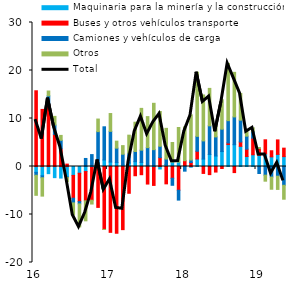
| Category | Maquinaria para la minería y la construcción | Buses y otros vehículos transporte | Camiones y vehículos de carga | Otros |
|---|---|---|---|---|
| 2016-03-01 | -1.213 | 15.775 | -0.613 | -4.175 |
| 2016-04-01 | -1.942 | 11.895 | -0.404 | -3.825 |
| 2016-05-01 | -1.491 | 12.864 | 1.858 | 1.003 |
| 2016-06-01 | -2.321 | 6.7 | 1.945 | 1.795 |
| 2016-07-01 | -2.407 | 3.67 | 1.787 | 1.022 |
| 2016-08-01 | -2.196 | 0.497 | -0.096 | -0.845 |
| 2016-09-01 | -1.855 | -4.757 | -0.971 | -2.512 |
| 2016-10-01 | -1.408 | -5.915 | -0.471 | -4.792 |
| 2016-11-01 | -1.056 | -6.1 | 1.675 | -4.161 |
| 2016-12-01 | -0.111 | -6.916 | 2.478 | -0.794 |
| 2017-01-01 | 0.698 | -8.519 | 6.567 | 2.621 |
| 2017-02-01 | 1.363 | -13.11 | 6.907 | -0.018 |
| 2017-03-01 | 0.921 | -13.717 | 6.403 | 3.71 |
| 2017-04-01 | 0.816 | -13.908 | 3.012 | 1.452 |
| 2017-05-01 | 0.305 | -13.155 | 2.256 | 1.787 |
| 2017-06-01 | 0.702 | -5.58 | 2.076 | 3.751 |
| 2017-07-01 | 1.002 | -1.924 | 2.126 | 6.097 |
| 2017-08-01 | 0.828 | -1.708 | 2.577 | 8.703 |
| 2017-09-01 | 0.169 | -3.657 | 3.76 | 6.466 |
| 2017-10-01 | -0.048 | -3.892 | 3.511 | 9.656 |
| 2017-11-01 | -0.515 | 1.85 | 2.367 | 7.241 |
| 2017-12-01 | 0.393 | -3.616 | 1.157 | 6.396 |
| 2018-01-01 | 0.92 | -2.448 | -1.466 | 4.077 |
| 2018-02-01 | 0.909 | -4.943 | -2.057 | 7.217 |
| 2018-03-01 | 0.222 | 0.985 | -0.971 | 7.041 |
| 2018-04-01 | -0.154 | 0.836 | 0.508 | 9.419 |
| 2018-05-01 | 1.564 | 1.617 | 3.1 | 13.351 |
| 2018-06-01 | 1.551 | -1.443 | 3.779 | 9.578 |
| 2018-07-01 | 2.508 | -1.692 | 5.968 | 7.798 |
| 2018-08-01 | 2.183 | -1.16 | 3.985 | 2.23 |
| 2018-09-01 | 3.115 | -0.42 | 4.659 | 6.13 |
| 2018-10-01 | 4.573 | 0.336 | 4.641 | 11.918 |
| 2018-11-01 | 4.542 | -1.269 | 5.787 | 9.285 |
| 2018-12-01 | 4.201 | 0.912 | 4.54 | 5.576 |
| 2019-01-01 | 2.078 | 1.535 | 2.707 | 0.913 |
| 2019-02-01 | 2.449 | 3.465 | 1.386 | 0.757 |
| 2019-03-01 | 2.331 | 1.428 | -1.462 | 0.199 |
| 2019-04-01 | 2.622 | 2.94 | -1.808 | -1.25 |
| 2019-05-01 | 2.01 | 1.273 | -2.204 | -2.533 |
| 2019-06-01 | 2.523 | 3.017 | -2.024 | -2.749 |
| 2019-07-01 | 2.061 | 1.761 | -3.912 | -2.903 |